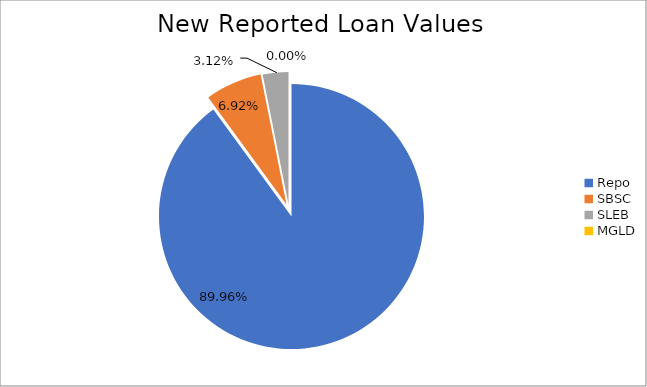
| Category | Series 0 |
|---|---|
| Repo | 11546741.498 |
| SBSC | 887885.006 |
| SLEB | 400815.294 |
| MGLD | 475.725 |